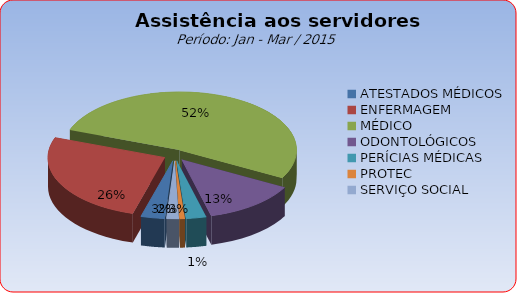
| Category | Series 0 |
|---|---|
| ATESTADOS MÉDICOS | 3.31 |
| ENFERMAGEM | 26.174 |
| MÉDICO | 52.348 |
| ODONTOLÓGICOS | 13.01 |
| PERÍCIAS MÉDICAS | 2.771 |
| PROTEC | 0.693 |
| SERVIÇO SOCIAL | 1.694 |